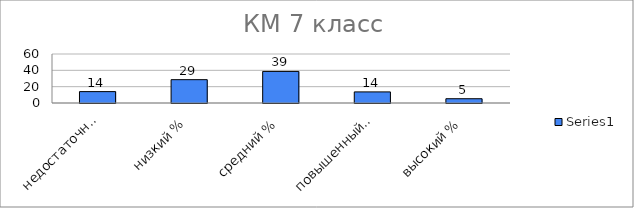
| Category | Series 0 |
|---|---|
| недостаточный % | 13.937 |
| низкий % | 28.571 |
| средний % | 38.676 |
| повышенный % | 13.589 |
| высокий % | 5.226 |